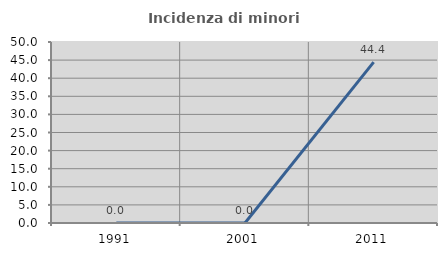
| Category | Incidenza di minori stranieri |
|---|---|
| 1991.0 | 0 |
| 2001.0 | 0 |
| 2011.0 | 44.444 |